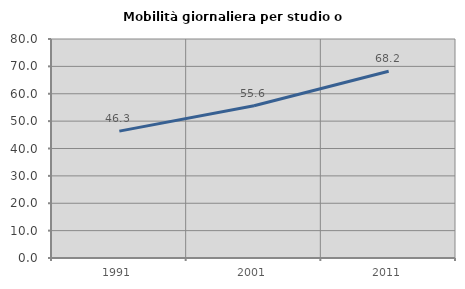
| Category | Mobilità giornaliera per studio o lavoro |
|---|---|
| 1991.0 | 46.344 |
| 2001.0 | 55.619 |
| 2011.0 | 68.244 |